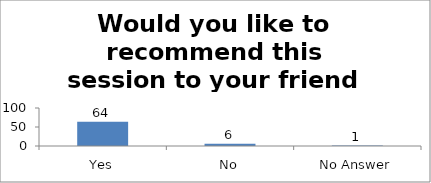
| Category | Would you like to recommend this session to your friend or colleague? |
|---|---|
| Yes | 64 |
| No | 6 |
| No Answer | 1 |